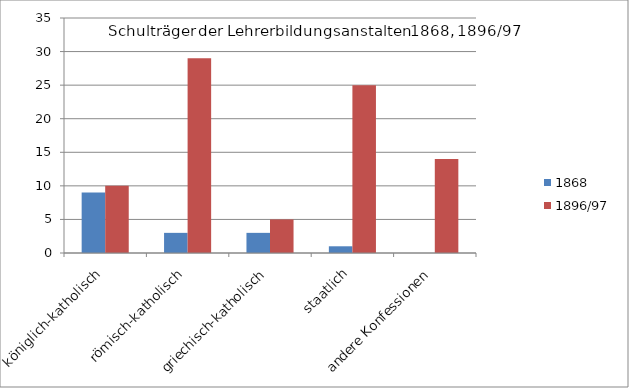
| Category | 1868 | 1896/97 |
|---|---|---|
| königlich-katholisch | 9 | 10 |
| römisch-katholisch | 3 | 29 |
| griechisch-katholisch | 3 | 5 |
| staatlich | 1 | 25 |
| andere Konfessionen | 0 | 14 |